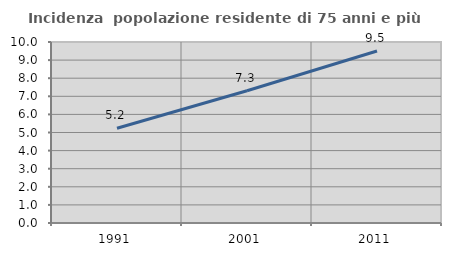
| Category | Incidenza  popolazione residente di 75 anni e più |
|---|---|
| 1991.0 | 5.234 |
| 2001.0 | 7.306 |
| 2011.0 | 9.505 |